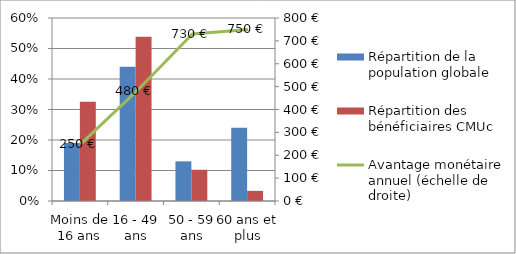
| Category | Répartition de la population globale | Répartition des bénéficiaires CMUc |
|---|---|---|
| Moins de 16 ans | 0.19 | 0.326 |
| 16 - 49 ans | 0.44 | 0.539 |
| 50 - 59 ans | 0.13 | 0.102 |
| 60 ans et plus | 0.24 | 0.033 |